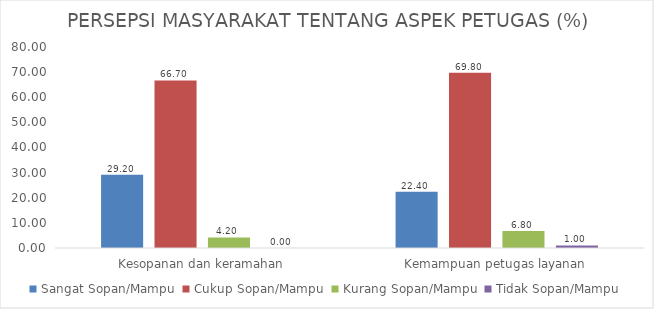
| Category | Sangat Sopan/Mampu | Cukup Sopan/Mampu | Kurang Sopan/Mampu | Tidak Sopan/Mampu |
|---|---|---|---|---|
| Kesopanan dan keramahan | 29.2 | 66.7 | 4.2 | 0 |
| Kemampuan petugas layanan | 22.4 | 69.8 | 6.8 | 1 |